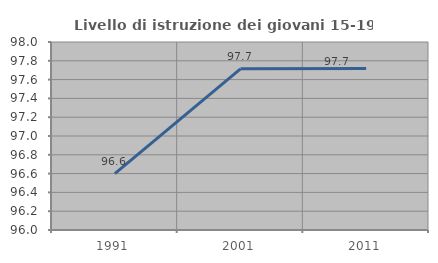
| Category | Livello di istruzione dei giovani 15-19 anni |
|---|---|
| 1991.0 | 96.6 |
| 2001.0 | 97.715 |
| 2011.0 | 97.717 |